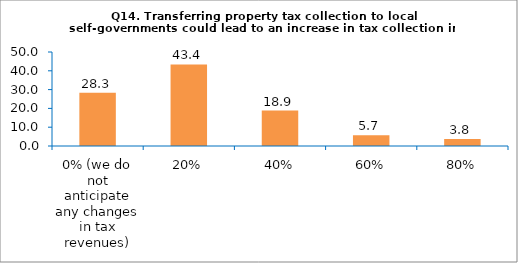
| Category | Series 0 |
|---|---|
| 0% (we do not anticipate any changes in tax revenues) | 28.302 |
| 20% | 43.396 |
| 40% | 18.868 |
| 60% | 5.66 |
| 80% | 3.774 |